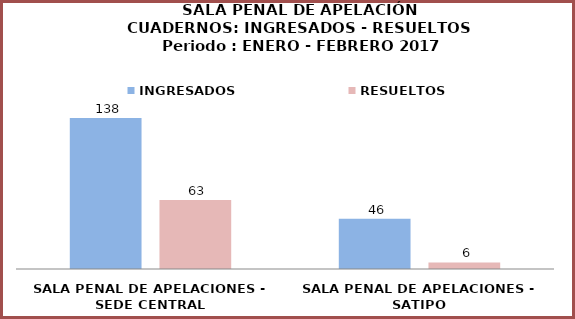
| Category | INGRESADOS | RESUELTOS |
|---|---|---|
| SALA PENAL DE APELACIONES - SEDE CENTRAL | 138 | 63 |
| SALA PENAL DE APELACIONES - SATIPO | 46 | 6 |